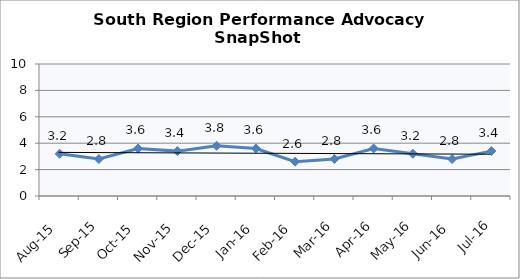
| Category | South Region |
|---|---|
| Aug-15 | 3.2 |
| Sep-15 | 2.8 |
| Oct-15 | 3.6 |
| Nov-15 | 3.4 |
| Dec-15 | 3.8 |
| Jan-16 | 3.6 |
| Feb-16 | 2.6 |
| Mar-16 | 2.8 |
| Apr-16 | 3.6 |
| May-16 | 3.2 |
| Jun-16 | 2.8 |
| Jul-16 | 3.4 |